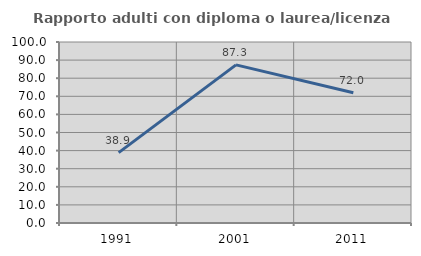
| Category | Rapporto adulti con diploma o laurea/licenza media  |
|---|---|
| 1991.0 | 38.876 |
| 2001.0 | 87.348 |
| 2011.0 | 72.006 |